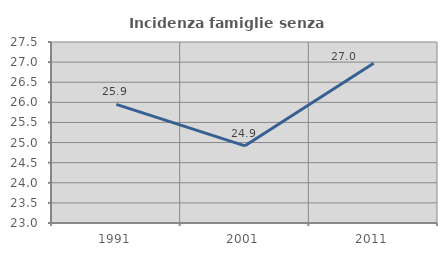
| Category | Incidenza famiglie senza nuclei |
|---|---|
| 1991.0 | 25.949 |
| 2001.0 | 24.918 |
| 2011.0 | 26.97 |